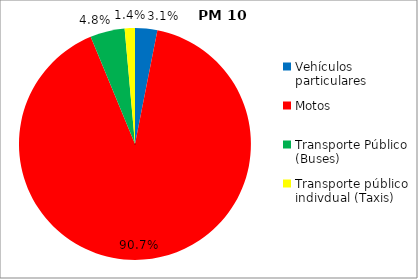
| Category | Series 0 |
|---|---|
| Vehículos particulares | 0.031 |
| Motos | 0.907 |
| Transporte Público (Buses) | 0.048 |
| Transporte público indivdual (Taxis) | 0.014 |